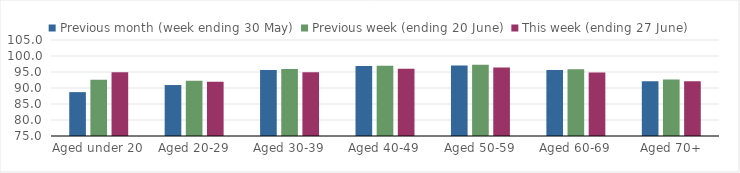
| Category | Previous month (week ending 30 May) | Previous week (ending 20 June) | This week (ending 27 June) |
|---|---|---|---|
| Aged under 20 | 88.707 | 92.598 | 94.886 |
| Aged 20-29 | 90.928 | 92.249 | 91.972 |
| Aged 30-39 | 95.643 | 95.901 | 94.892 |
| Aged 40-49 | 96.838 | 96.931 | 96.034 |
| Aged 50-59 | 97.06 | 97.286 | 96.396 |
| Aged 60-69 | 95.626 | 95.855 | 94.84 |
| Aged 70+ | 92.084 | 92.678 | 92.113 |